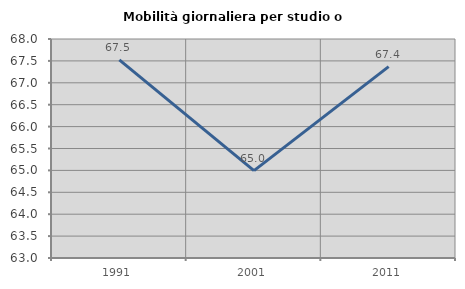
| Category | Mobilità giornaliera per studio o lavoro |
|---|---|
| 1991.0 | 67.524 |
| 2001.0 | 64.996 |
| 2011.0 | 67.368 |